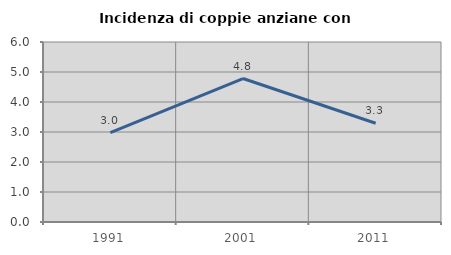
| Category | Incidenza di coppie anziane con figli |
|---|---|
| 1991.0 | 2.979 |
| 2001.0 | 4.783 |
| 2011.0 | 3.292 |